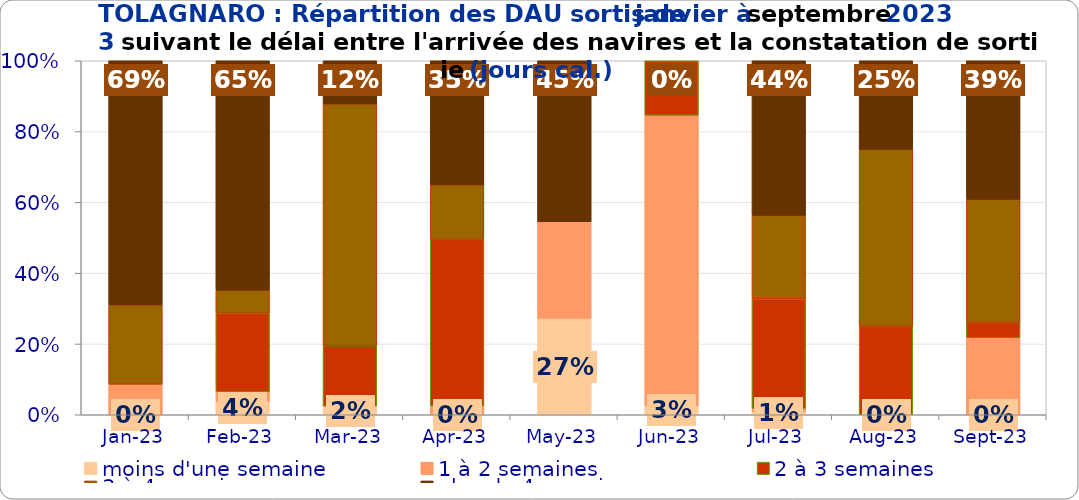
| Category | moins d'une semaine | 1 à 2 semaines | 2 à 3 semaines | 3 à 4 semaines | plus de 4 semaines |
|---|---|---|---|---|---|
| 2023-01-01 | 0 | 0.086 | 0 | 0.224 | 0.69 |
| 2023-02-01 | 0.037 | 0.028 | 0.222 | 0.065 | 0.648 |
| 2023-03-01 | 0.024 | 0 | 0.171 | 0.683 | 0.122 |
| 2023-04-01 | 0 | 0.026 | 0.47 | 0.154 | 0.35 |
| 2023-05-01 | 0.273 | 0.273 | 0 | 0 | 0.455 |
| 2023-06-01 | 0.026 | 0.821 | 0.154 | 0 | 0 |
| 2023-07-01 | 0.009 | 0.009 | 0.309 | 0.236 | 0.436 |
| 2023-08-01 | 0 | 0 | 0.25 | 0.5 | 0.25 |
| 2023-09-01 | 0 | 0.217 | 0.043 | 0.348 | 0.391 |